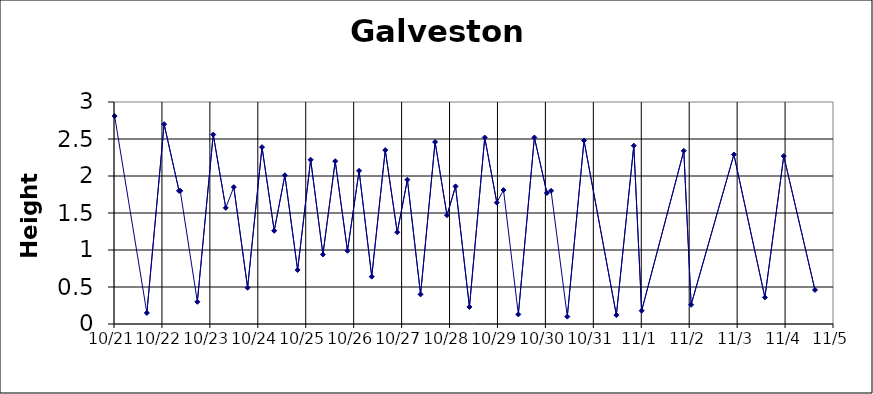
| Category | Series 0 |
|---|---|
| 38281.013194444444 | 2.81 |
| 38281.68541666667 | 0.15 |
| 38282.04583333333 | 2.7 |
| 38282.356944444444 | 1.8 |
| 38282.381944444445 | 1.8 |
| 38282.73888888889 | 0.3 |
| 38283.07013888889 | 2.56 |
| 38283.33125 | 1.57 |
| 38283.49930555555 | 1.85 |
| 38283.78680555556 | 0.49 |
| 38284.08819444444 | 2.39 |
| 38284.342361111114 | 1.26 |
| 38284.56458333333 | 2.01 |
| 38284.830555555556 | 0.73 |
| 38285.10277777778 | 2.22 |
| 38285.35833333333 | 0.94 |
| 38285.615277777775 | 2.2 |
| 38285.870833333334 | 0.99 |
| 38286.11319444444 | 2.07 |
| 38286.37708333333 | 0.64 |
| 38286.65902777778 | 2.35 |
| 38286.90902777778 | 1.24 |
| 38287.120833333334 | 1.95 |
| 38287.395833333336 | 0.4 |
| 38287.69861111111 | 2.46 |
| 38287.947222222225 | 1.47 |
| 38288.12569444445 | 1.86 |
| 38288.41527777778 | 0.23 |
| 38288.73472222222 | 2.52 |
| 38288.98611111111 | 1.64 |
| 38289.126388888886 | 1.81 |
| 38289.43541666667 | 0.13 |
| 38289.77013888889 | 2.52 |
| 38290.03194444445 | 1.77 |
| 38290.11875 | 1.8 |
| 38290.45694444444 | 0.1 |
| 38290.805555555555 | 2.48 |
| 38291.48055555556 | 0.12 |
| 38291.84444444445 | 2.41 |
| 38292.00833333333 | 0.18 |
| 38292.8875 | 2.34 |
| 38293.04027777778 | 0.26 |
| 38293.93263888889 | 2.29 |
| 38294.57916666667 | 0.36 |
| 38294.972916666666 | 2.27 |
| 38295.623611111114 | 0.46 |